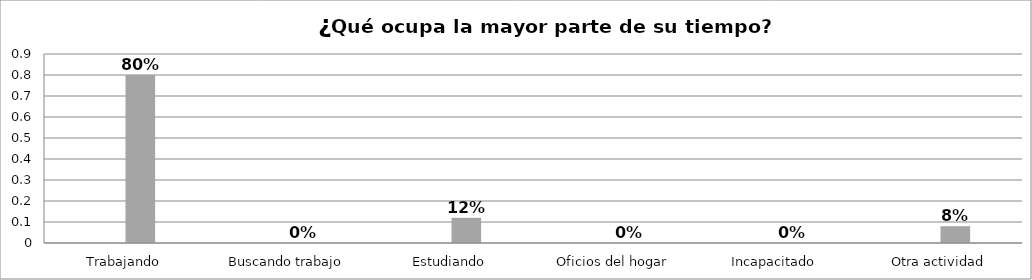
| Category | Series 0 | Series 1 | Series 2 | Series 3 |
|---|---|---|---|---|
| Trabajando |  |  | 0.8 |  |
| Buscando trabajo |  |  | 0 |  |
| Estudiando |  |  | 0.12 |  |
| Oficios del hogar |  |  | 0 |  |
| Incapacitado  |  |  | 0 |  |
| Otra actividad |  |  | 0.08 |  |